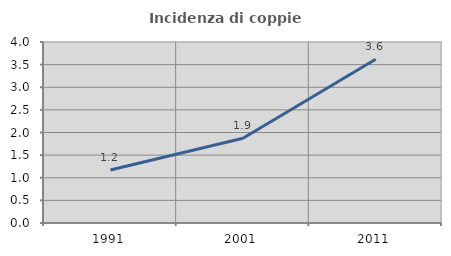
| Category | Incidenza di coppie miste |
|---|---|
| 1991.0 | 1.171 |
| 2001.0 | 1.871 |
| 2011.0 | 3.619 |